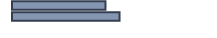
| Category | 46,5 |
|---|---|
| 0 | 46.5 |
| 1 | 53.5 |